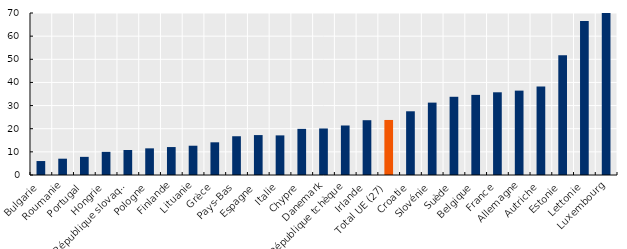
| Category | Series 0 |
|---|---|
| Bulgarie | 6.035 |
| Roumanie | 7.046 |
| Portugal | 7.84 |
| Hongrie | 10.005 |
| République slovaque | 10.805 |
| Pologne | 11.518 |
| Finlande | 12.078 |
| Lituanie | 12.65 |
| Grèce | 14.128 |
| Pays-Bas | 16.748 |
| Espagne | 17.252 |
| Italie | 17.119 |
| Chypre | 19.934 |
| Danemark | 20.102 |
| République tchèque | 21.393 |
| Irlande | 23.676 |
| Total UE (27) | 23.782 |
| Croatie | 27.533 |
| Slovénie | 31.277 |
| Suède | 33.798 |
| Belgique | 34.616 |
| France | 35.741 |
| Allemagne | 36.458 |
| Autriche | 38.24 |
| Estonie | 51.797 |
| Lettonie | 66.57 |
| Luxembourg | 82.784 |